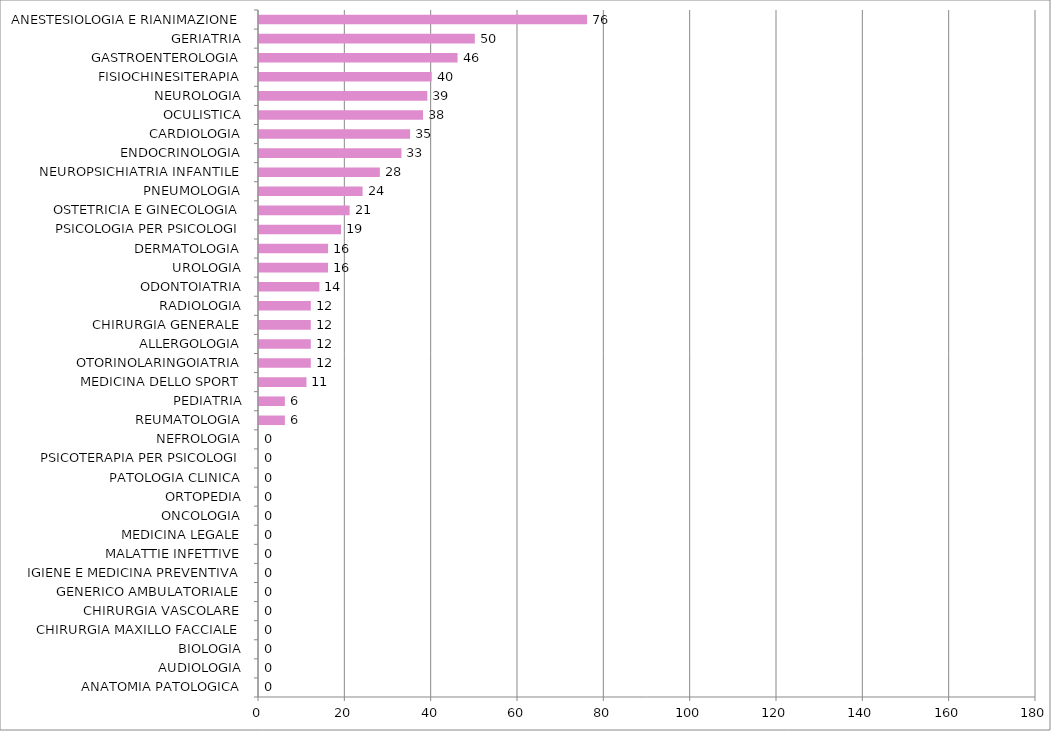
| Category | Series 0 |
|---|---|
| ANATOMIA PATOLOGICA | 0 |
| AUDIOLOGIA | 0 |
| BIOLOGIA | 0 |
| CHIRURGIA MAXILLO FACCIALE | 0 |
| CHIRURGIA VASCOLARE | 0 |
| GENERICO AMBULATORIALE | 0 |
| IGIENE E MEDICINA PREVENTIVA | 0 |
| MALATTIE INFETTIVE | 0 |
| MEDICINA LEGALE | 0 |
| ONCOLOGIA | 0 |
| ORTOPEDIA | 0 |
| PATOLOGIA CLINICA | 0 |
| PSICOTERAPIA PER PSICOLOGI | 0 |
| NEFROLOGIA | 0 |
| REUMATOLOGIA | 6 |
| PEDIATRIA | 6 |
| MEDICINA DELLO SPORT | 11 |
| OTORINOLARINGOIATRIA | 12 |
| ALLERGOLOGIA | 12 |
| CHIRURGIA GENERALE | 12 |
| RADIOLOGIA | 12 |
| ODONTOIATRIA | 14 |
| UROLOGIA | 16 |
| DERMATOLOGIA | 16 |
| PSICOLOGIA PER PSICOLOGI | 19 |
| OSTETRICIA E GINECOLOGIA | 21 |
| PNEUMOLOGIA | 24 |
| NEUROPSICHIATRIA INFANTILE | 28 |
| ENDOCRINOLOGIA | 33 |
| CARDIOLOGIA | 35 |
| OCULISTICA | 38 |
| NEUROLOGIA | 39 |
| FISIOCHINESITERAPIA | 40 |
| GASTROENTEROLOGIA | 46 |
| GERIATRIA | 50 |
| ANESTESIOLOGIA E RIANIMAZIONE | 76 |